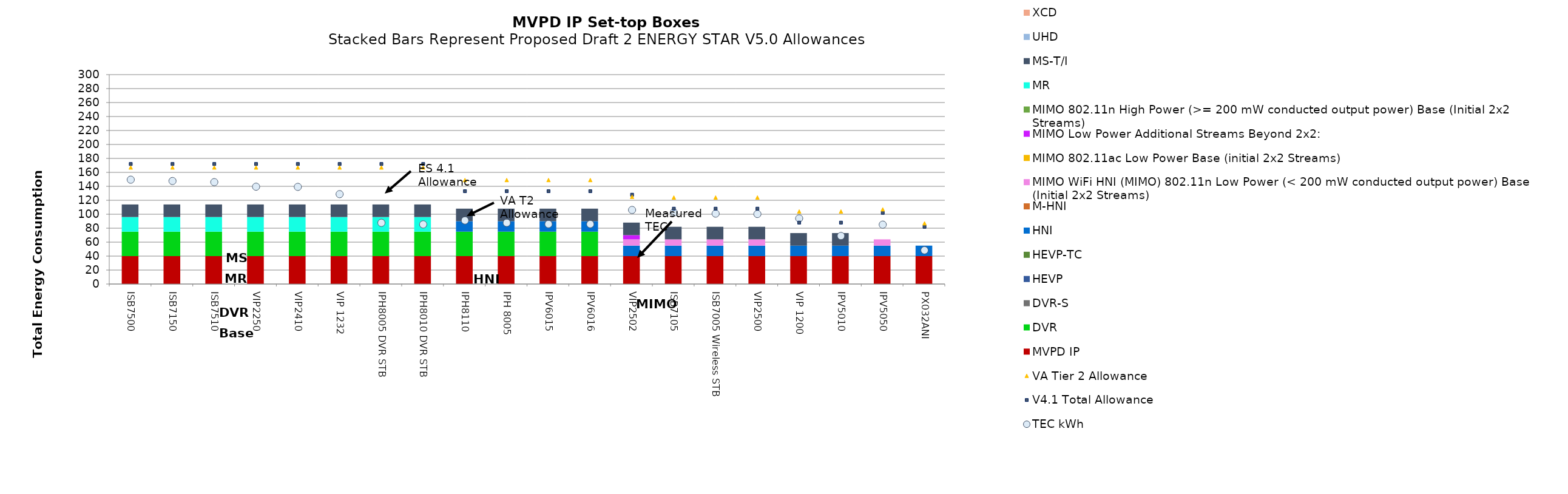
| Category | MVPD IP | Terrestrial  | AVP | DVR | DVR-S | HD | HEVP | HEVP-TC | HNI | M-HNI | W-HNI | MIMO WiFi HNI (MIMO)  | MIMO 2.4 (Each Stream) | MIMO 5 (Each Stream) | MIMO WiFi HNI (MIMO) 802.11n Low Power (< 200 mW conducted output power) Base (Initial 2x2 Streams) | MIMO 802.11ac Low Power Base (initial 2x2 Streams) | MIMO Low Power Additional Streams Beyond 2x2: | MIMO 802.11n High Power (>= 200 mW conducted output power) Base (Initial 2x2 Streams) | MIMO 802.11ac High Power Base (initial 2x2 Streams) | MIMO High Power Additional Streams Beyond 2x2: | MR | MS-T/I | UHD | XCD | VA Base kWh | VA Adder Allowances kWh | Meets VA? | V4.1 Base kWh | V4.1 Adder Allowances kWh | TEC-V4.1Adder | Meets V4.1? | V5.0 Adder Allowances kWh | V5.0 Base kWh | Meets V5.0 with 5% Margin |
|---|---|---|---|---|---|---|---|---|---|---|---|---|---|---|---|---|---|---|---|---|---|---|---|---|---|---|---|---|---|---|---|---|---|---|
| ISB7500 | 40 |  |  | 35 | 0 |  | 0 | 0 | 0 | 0 |  |  |  |  | 0 | 0 | 0 | 0 |  |  | 21 | 18 | 0 | 0 |  |  |  |  |  |  |  |  |  |  |
| ISB7150 | 40 |  |  | 35 | 0 |  | 0 | 0 | 0 | 0 |  |  |  |  | 0 | 0 | 0 | 0 |  |  | 21 | 18 | 0 | 0 |  |  |  |  |  |  |  |  |  |  |
| ISB7510 | 40 |  |  | 35 | 0 |  | 0 | 0 | 0 | 0 |  |  |  |  | 0 | 0 | 0 | 0 |  |  | 21 | 18 | 0 | 0 |  |  |  |  |  |  |  |  |  |  |
| VIP2250 | 40 |  |  | 35 | 0 |  | 0 | 0 | 0 | 0 |  |  |  |  | 0 | 0 | 0 | 0 |  |  | 21 | 18 | 0 | 0 |  |  |  |  |  |  |  |  |  |  |
| VIP2410 | 40 |  |  | 35 | 0 |  | 0 | 0 | 0 | 0 |  |  |  |  | 0 | 0 | 0 | 0 |  |  | 21 | 18 | 0 | 0 |  |  |  |  |  |  |  |  |  |  |
| VIP 1232 | 40 |  |  | 35 | 0 |  | 0 | 0 | 0 | 0 |  |  |  |  | 0 | 0 | 0 | 0 |  |  | 21 | 18 | 0 | 0 |  |  |  |  |  |  |  |  |  |  |
| IPH8005 DVR STB | 40 |  |  | 35 | 0 |  | 0 | 0 | 0 | 0 |  |  |  |  | 0 | 0 | 0 | 0 |  |  | 21 | 18 | 0 | 0 |  |  |  |  |  |  |  |  |  |  |
| IPH8010 DVR STB | 40 |  |  | 35 | 0 |  | 0 | 0 | 0 | 0 |  |  |  |  | 0 | 0 | 0 | 0 |  |  | 21 | 18 | 0 | 0 |  |  |  |  |  |  |  |  |  |  |
| IPH8110 | 40 |  |  | 35 | 0 |  | 0 | 0 | 15 | 0 |  |  |  |  | 0 | 0 | 0 | 0 |  |  | 0 | 18 | 0 | 0 |  |  |  |  |  |  |  |  |  |  |
| IPH 8005 | 40 |  |  | 35 | 0 |  | 0 | 0 | 15 | 0 |  |  |  |  | 0 | 0 | 0 | 0 |  |  | 0 | 18 | 0 | 0 |  |  |  |  |  |  |  |  |  |  |
| IPV6015 | 40 |  |  | 35 | 0 |  | 0 | 0 | 15 | 0 |  |  |  |  | 0 | 0 | 0 | 0 |  |  | 0 | 18 | 0 | 0 |  |  |  |  |  |  |  |  |  |  |
| IPV6016 | 40 |  |  | 35 | 0 |  | 0 | 0 | 15 | 0 |  |  |  |  | 0 | 0 | 0 | 0 |  |  | 0 | 18 | 0 | 0 |  |  |  |  |  |  |  |  |  |  |
| VIP2502 | 40 |  |  | 0 | 0 |  | 0 | 0 | 15 | 0 |  |  |  |  | 9 | 0 | 6 | 0 |  |  | 0 | 18 | 0 | 0 |  |  |  |  |  |  |  |  |  |  |
| ISB7105 | 40 |  |  | 0 | 0 |  | 0 | 0 | 15 | 0 |  |  |  |  | 9 | 0 | 0 | 0 |  |  | 0 | 18 | 0 | 0 |  |  |  |  |  |  |  |  |  |  |
| ISB7005 Wireless STB | 40 |  |  | 0 | 0 |  | 0 | 0 | 15 | 0 |  |  |  |  | 9 | 0 | 0 | 0 |  |  | 0 | 18 | 0 | 0 |  |  |  |  |  |  |  |  |  |  |
| VIP2500 | 40 |  |  | 0 | 0 |  | 0 | 0 | 15 | 0 |  |  |  |  | 9 | 0 | 0 | 0 |  |  | 0 | 18 | 0 | 0 |  |  |  |  |  |  |  |  |  |  |
| VIP 1200 | 40 |  |  | 0 | 0 |  | 0 | 0 | 15 | 0 |  |  |  |  | 0 | 0 | 0 | 0 |  |  | 0 | 18 | 0 | 0 |  |  |  |  |  |  |  |  |  |  |
| IPV5010 | 40 |  |  | 0 | 0 |  | 0 | 0 | 15 | 0 |  |  |  |  | 0 | 0 | 0 | 0 |  |  | 0 | 18 | 0 | 0 |  |  |  |  |  |  |  |  |  |  |
| IPV5050 | 40 |  |  | 0 | 0 |  | 0 | 0 | 15 | 0 |  |  |  |  | 9 | 0 | 0 | 0 |  |  | 0 | 0 | 0 | 0 |  |  |  |  |  |  |  |  |  |  |
| PX032ANI | 40 |  |  | 0 | 0 |  | 0 | 0 | 15 | 0 |  |  |  |  | 0 | 0 | 0 | 0 |  |  | 0 | 0 | 0 | 0 |  |  |  |  |  |  |  |  |  |  |